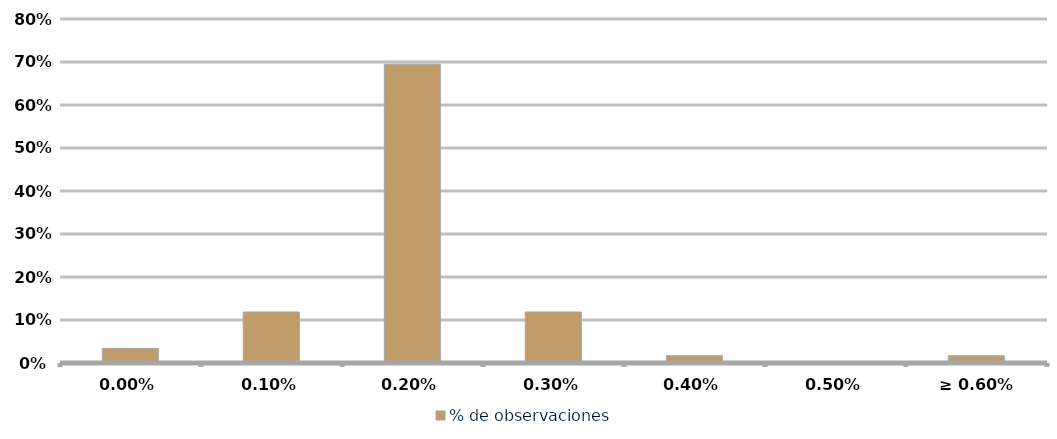
| Category | % de observaciones  |
|---|---|
| 0,00% | 0.034 |
| 0,10% | 0.119 |
| 0,20% | 0.695 |
| 0,30% | 0.119 |
| 0,40% | 0.017 |
| 0,50% | 0 |
| ≥ 0.60% | 0.017 |